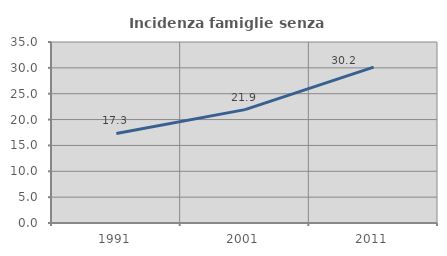
| Category | Incidenza famiglie senza nuclei |
|---|---|
| 1991.0 | 17.318 |
| 2001.0 | 21.925 |
| 2011.0 | 30.154 |